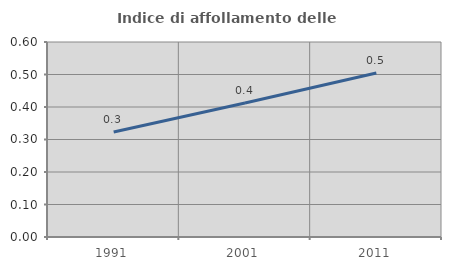
| Category | Indice di affollamento delle abitazioni  |
|---|---|
| 1991.0 | 0.323 |
| 2001.0 | 0.412 |
| 2011.0 | 0.505 |